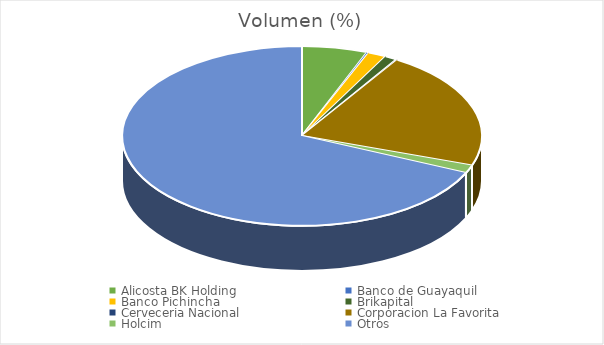
| Category | Volumen |
|---|---|
| Alicosta BK Holding | 27000 |
| Banco de Guayaquil | 836 |
| Banco Pichincha | 7500 |
| Brikapital | 5000 |
| Cerveceria Nacional | 466.56 |
| Corporacion La Favorita | 98339.25 |
| Holcim | 6600 |
| Otros | 312910 |